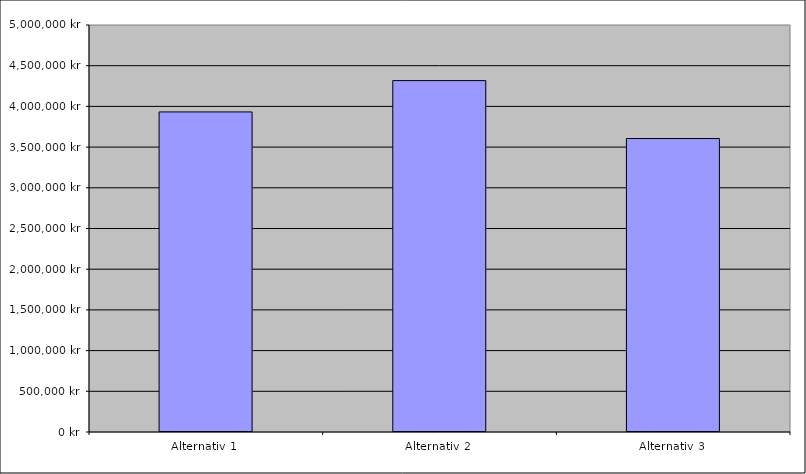
| Category | Series 0 |
|---|---|
| Alternativ 1 | 3932136.388 |
| Alternativ 2 | 4316895.764 |
| Alternativ 3 | 3605115.049 |